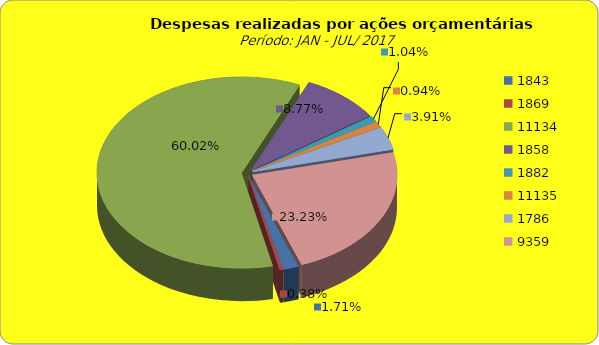
| Category | Series 1 |
|---|---|
| 1843.0 | 2669074.02 |
| 1869.0 | 593864.77 |
| 11134.0 | 93954229.69 |
| 1858.0 | 13733703.09 |
| 1882.0 | 1631563.07 |
| 11135.0 | 1473248.6 |
| 1786.0 | 6113692.75 |
| 9359.0 | 36362731.81 |